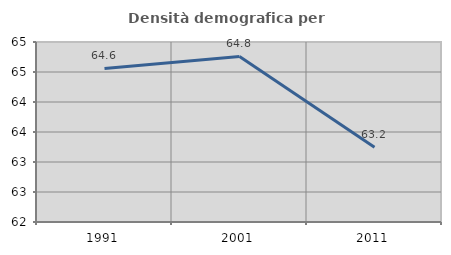
| Category | Densità demografica |
|---|---|
| 1991.0 | 64.56 |
| 2001.0 | 64.76 |
| 2011.0 | 63.245 |